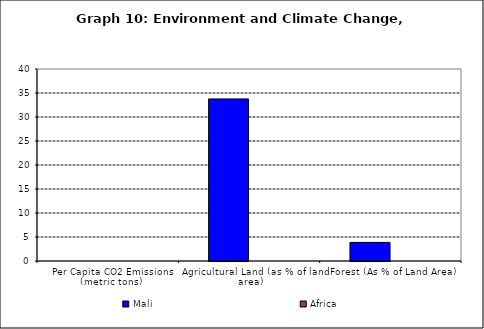
| Category | Mali | Africa |
|---|---|---|
| Per Capita CO2 Emissions (metric tons) | 0 | 0 |
| Agricultural Land (as % of land area) | 33.766 | 0 |
| Forest (As % of Land Area) | 3.864 | 0 |